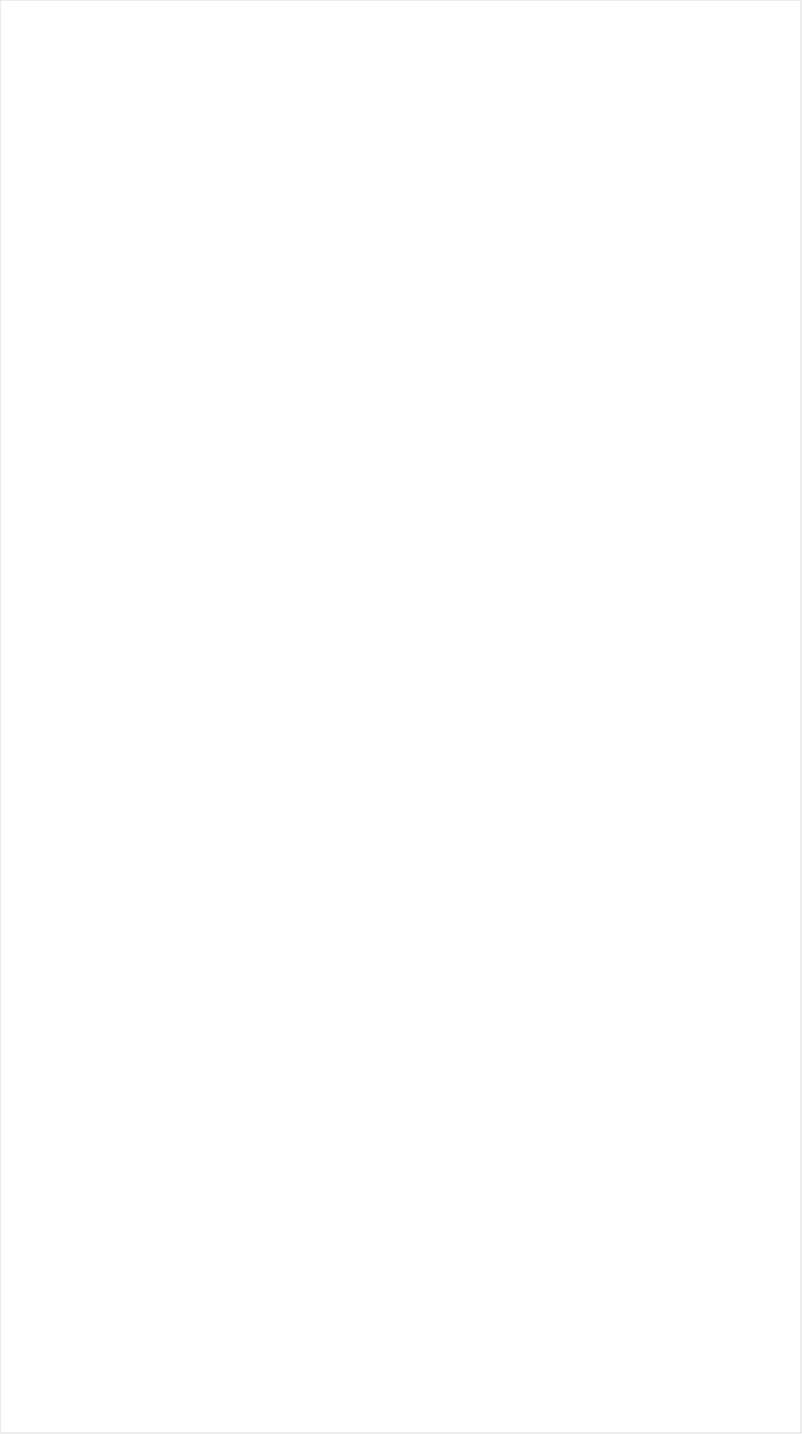
| Category | Total |
|---|---|
| Cartoon Network | -1 |
| Galavision | -0.914 |
| UniMas | -0.888 |
| Univision | -0.856 |
| NBC Universo | -0.847 |
| Telemundo | -0.845 |
| TUDN | -0.839 |
| MTV2 | -0.692 |
| BET | -0.642 |
| TV ONE | -0.641 |
| VH1 | -0.608 |
| Nick Toons | -0.577 |
| BET Her | -0.57 |
| Disney XD | -0.545 |
| Adult Swim | -0.514 |
| Nick | -0.503 |
| Teen Nick | -0.502 |
| Lifetime Movies | -0.478 |
| Nick Jr. | -0.449 |
| Disney Channel | -0.445 |
| WE TV | -0.424 |
| Oprah Winfrey Network | -0.382 |
| TLC | -0.376 |
| Logo | -0.371 |
| Travel | -0.359 |
| Disney Junior US | -0.336 |
| Investigation Discovery | -0.329 |
| Universal Kids | -0.329 |
| UP TV | -0.297 |
| Discovery Life Channel | -0.289 |
| Lifetime | -0.287 |
| Nick@Nite | -0.259 |
| A&E | -0.224 |
| MTV | -0.221 |
| USA Network | -0.194 |
| Ovation | -0.166 |
| E! | -0.166 |
| Hallmark | -0.156 |
| OXYGEN | -0.154 |
| FX | -0.152 |
| SYFY | -0.147 |
| Discovery Family Channel | -0.138 |
| Headline News | -0.138 |
| INSP | -0.129 |
| ION | -0.124 |
| Hallmark Movies & Mysteries | -0.116 |
| truTV | -0.115 |
| CW | -0.087 |
| TNT | -0.064 |
| CMTV | -0.042 |
| TBS | -0.033 |
| NBA TV | -0.02 |
| POP | -0.002 |
| Science Channel | 0.017 |
| Reelz Channel | 0.019 |
| SundanceTV | 0.032 |
| MyNetworkTV | 0.032 |
| Paramount Network | 0.036 |
| Game Show | 0.056 |
| Viceland | 0.06 |
| Freeform | 0.06 |
| MSNBC | 0.072 |
| CNN | 0.073 |
| BRAVO | 0.085 |
| Animal Planet | 0.087 |
| Discovery Channel | 0.092 |
| TV LAND | 0.094 |
| FX Movie Channel | 0.094 |
| National Geographic Wild | 0.096 |
| FXX | 0.096 |
| FOX | 0.098 |
| Motor Trend Network | 0.131 |
| Comedy Central | 0.133 |
| HGTV | 0.134 |
| FYI | 0.144 |
| History Channel | 0.158 |
| National Geographic | 0.165 |
| Food Network | 0.17 |
| WGN America | 0.174 |
| Great American Country | 0.19 |
| AMC | 0.192 |
| American Heroes Channel | 0.224 |
| Cooking Channel | 0.231 |
| ABC | 0.233 |
| Destination America | 0.284 |
| RFD TV | 0.291 |
| FXDEP | 0.329 |
| Weather Channel | 0.333 |
| DIY | 0.357 |
| CBS | 0.373 |
| CNBC | 0.375 |
| BBC America | 0.387 |
| NBC | 0.391 |
| Smithsonian | 0.424 |
| Independent Film (IFC) | 0.437 |
| Fox News | 0.438 |
| NFL Network | 0.479 |
| Outdoor Channel | 0.547 |
| Fox Business | 0.563 |
| The Sportsman Channel | 0.579 |
| ESPN Deportes | 0.619 |
| PBS | 0.647 |
| Bloomberg HD | 0.659 |
| ESPNEWS | 0.692 |
| ESPN | 0.735 |
| Fox Sports 1 | 0.741 |
| NBC Sports | 0.813 |
| PAC-12 Network | 0.877 |
| Olympic Channel | 0.919 |
| ESPNU | 1.019 |
| Big Ten Network | 1.042 |
| MLB Network | 1.099 |
| Tennis Channel | 1.139 |
| CBS Sports | 1.148 |
| ESPN2 | 1.176 |
| FOX Sports 2 | 1.193 |
| NHL | 1.253 |
| Golf | 6.076 |